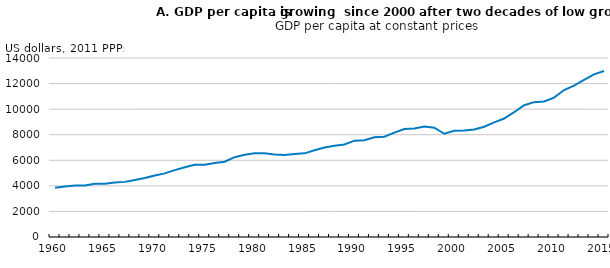
| Category | GDP per capita at constant prices (2011 USD PPP) |
|---|---|
| 1960.0 | 3859.635 |
| 1961.0 | 3942.777 |
| 1962.0 | 4035.259 |
| 1963.0 | 4029.63 |
| 1964.0 | 4168.898 |
| 1965.0 | 4168.361 |
| 1966.0 | 4261.715 |
| 1967.0 | 4311.348 |
| 1968.0 | 4458.148 |
| 1969.0 | 4619.397 |
| 1970.0 | 4813.032 |
| 1971.0 | 4975.255 |
| 1972.0 | 5233.251 |
| 1973.0 | 5460.821 |
| 1974.0 | 5647.148 |
| 1975.0 | 5646.067 |
| 1976.0 | 5785.672 |
| 1977.0 | 5890.353 |
| 1978.0 | 6244.95 |
| 1979.0 | 6432.72 |
| 1980.0 | 6545.607 |
| 1981.0 | 6543.227 |
| 1982.0 | 6457.112 |
| 1983.0 | 6413.603 |
| 1984.0 | 6483.982 |
| 1985.0 | 6541.623 |
| 1986.0 | 6779.672 |
| 1987.0 | 6999.185 |
| 1988.0 | 7139.506 |
| 1989.0 | 7241.001 |
| 1990.0 | 7533.519 |
| 1991.0 | 7562.697 |
| 1992.0 | 7799.909 |
| 1993.0 | 7844.022 |
| 1994.0 | 8160.12 |
| 1995.0 | 8442.85 |
| 1996.0 | 8478.951 |
| 1997.0 | 8634.47 |
| 1998.0 | 8553.382 |
| 1999.0 | 8073.373 |
| 2000.0 | 8308.223 |
| 2001.0 | 8327.071 |
| 2002.0 | 8415.759 |
| 2003.0 | 8625.247 |
| 2004.0 | 8963.597 |
| 2005.0 | 9263.73 |
| 2006.0 | 9760.13 |
| 2007.0 | 10306.93 |
| 2008.0 | 10547.233 |
| 2009.0 | 10599.94 |
| 2010.0 | 10900.504 |
| 2011.0 | 11496.527 |
| 2012.0 | 11840.356 |
| 2013.0 | 12296.456 |
| 2014.0 | 12715.143 |
| 2015.0 | 12988.168 |